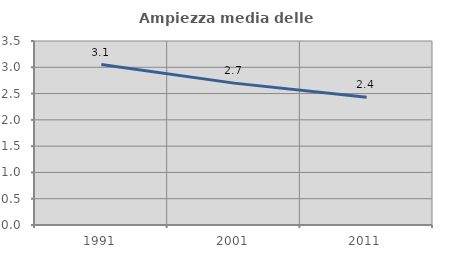
| Category | Ampiezza media delle famiglie |
|---|---|
| 1991.0 | 3.053 |
| 2001.0 | 2.699 |
| 2011.0 | 2.428 |